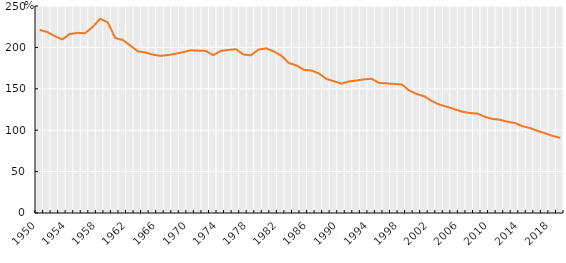
| Category | LAC relative productivity |
|---|---|
| 1950.0 | 221.136 |
| 1951.0 | 218.577 |
| 1952.0 | 213.507 |
| 1953.0 | 209.722 |
| 1954.0 | 216.203 |
| 1955.0 | 217.593 |
| 1956.0 | 217.089 |
| 1957.0 | 224.592 |
| 1958.0 | 234.404 |
| 1959.0 | 230.437 |
| 1960.0 | 211.368 |
| 1961.0 | 208.944 |
| 1962.0 | 202.302 |
| 1963.0 | 195.272 |
| 1964.0 | 193.913 |
| 1965.0 | 191.224 |
| 1966.0 | 189.804 |
| 1967.0 | 190.785 |
| 1968.0 | 192.269 |
| 1969.0 | 194.286 |
| 1970.0 | 196.571 |
| 1971.0 | 196.084 |
| 1972.0 | 195.737 |
| 1973.0 | 190.688 |
| 1974.0 | 195.642 |
| 1975.0 | 197.026 |
| 1976.0 | 197.836 |
| 1977.0 | 191.514 |
| 1978.0 | 190.438 |
| 1979.0 | 197.343 |
| 1980.0 | 198.888 |
| 1981.0 | 195.285 |
| 1982.0 | 190.124 |
| 1983.0 | 181.294 |
| 1984.0 | 178.311 |
| 1985.0 | 172.936 |
| 1986.0 | 172.135 |
| 1987.0 | 168.533 |
| 1988.0 | 161.966 |
| 1989.0 | 159.1 |
| 1990.0 | 156.106 |
| 1991.0 | 158.95 |
| 1992.0 | 159.995 |
| 1993.0 | 161.412 |
| 1994.0 | 162.142 |
| 1995.0 | 156.987 |
| 1996.0 | 156.57 |
| 1997.0 | 155.795 |
| 1998.0 | 155.269 |
| 1999.0 | 147.791 |
| 2000.0 | 143.642 |
| 2001.0 | 140.861 |
| 2002.0 | 135.039 |
| 2003.0 | 130.877 |
| 2004.0 | 128.306 |
| 2005.0 | 125.268 |
| 2006.0 | 122.392 |
| 2007.0 | 120.734 |
| 2008.0 | 120.104 |
| 2009.0 | 116.26 |
| 2010.0 | 113.569 |
| 2011.0 | 112.658 |
| 2012.0 | 110.167 |
| 2013.0 | 108.696 |
| 2014.0 | 104.756 |
| 2015.0 | 102.671 |
| 2016.0 | 99.082 |
| 2017.0 | 96.339 |
| 2018.0 | 93.069 |
| 2019.0 | 90.738 |